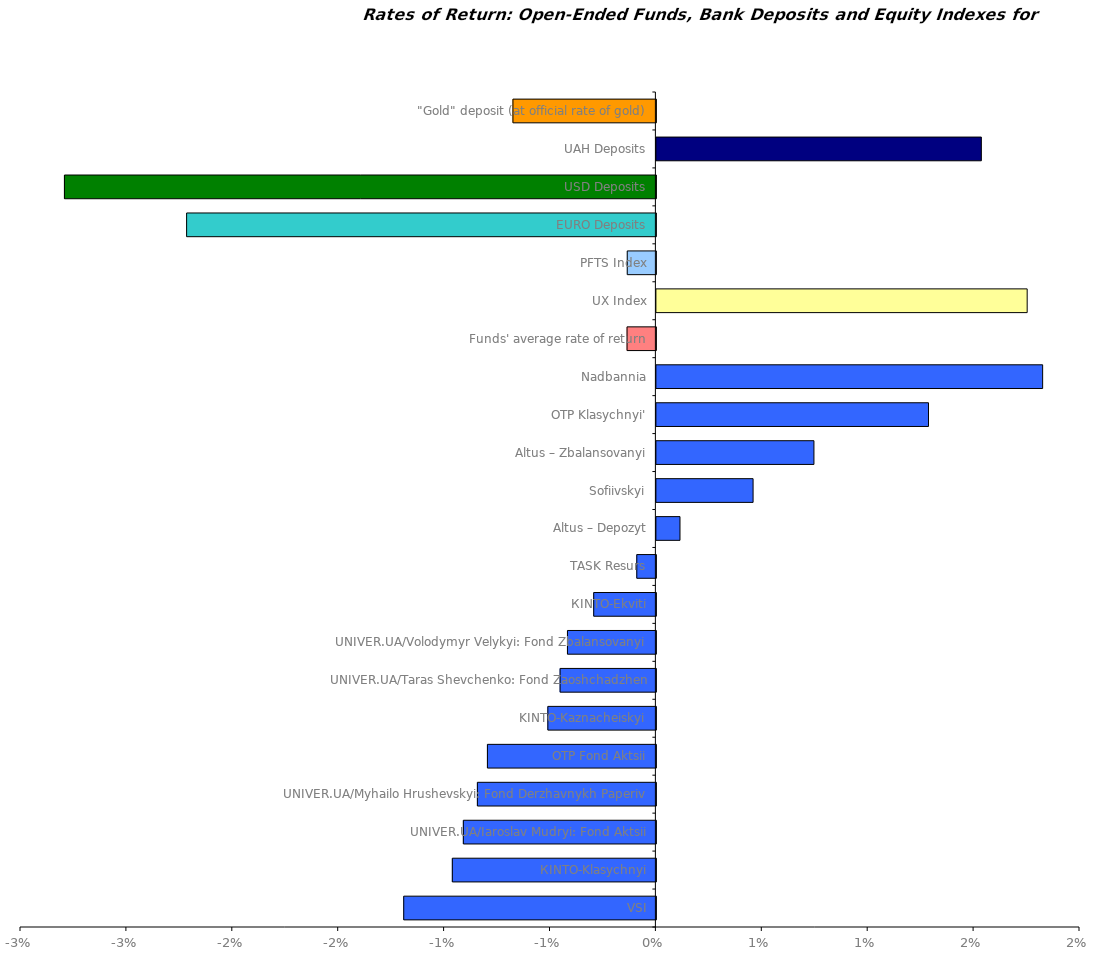
| Category | Series 0 |
|---|---|
| VSI | -0.012 |
| КІNТО-Klasychnyi | -0.01 |
| UNIVER.UA/Iaroslav Mudryi: Fond Aktsii | -0.009 |
| UNIVER.UA/Myhailo Hrushevskyi: Fond Derzhavnykh Paperiv | -0.008 |
| OTP Fond Aktsii | -0.008 |
| KINTO-Kaznacheiskyi | -0.005 |
| UNIVER.UA/Taras Shevchenko: Fond Zaoshchadzhen | -0.005 |
| UNIVER.UA/Volodymyr Velykyi: Fond Zbalansovanyi | -0.004 |
| КІNTO-Ekviti | -0.003 |
| ТАSK Resurs | -0.001 |
| Altus – Depozyt | 0.001 |
| Sofiivskyi | 0.005 |
| Altus – Zbalansovanyi | 0.007 |
| OTP Klasychnyi' | 0.013 |
| Nadbannia | 0.018 |
| Funds' average rate of return | -0.001 |
| UX Index | 0.018 |
| PFTS Index | -0.001 |
| EURO Deposits | -0.022 |
| USD Deposits | -0.028 |
| UAH Deposits | 0.015 |
| "Gold" deposit (at official rate of gold) | -0.007 |